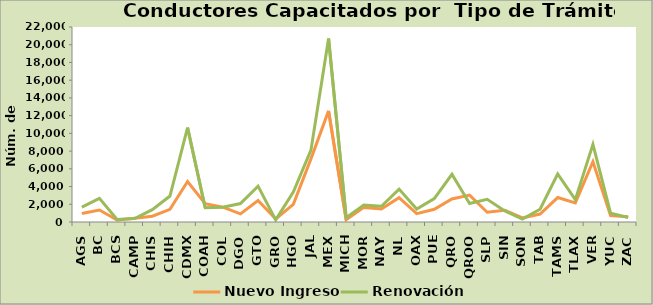
| Category | Nuevo Ingreso | Renovación |
|---|---|---|
| AGS | 957 | 1677 |
| BC | 1358 | 2666 |
| BCS | 223 | 280 |
| CAMP | 436 | 392 |
| CHIS | 649 | 1389 |
| CHIH | 1432 | 2927 |
| CDMX | 4566 | 10641 |
| COAH | 2066 | 1613 |
| COL | 1674 | 1664 |
| DGO | 912 | 2086 |
| GTO | 2421 | 4044 |
| GRO | 340 | 235 |
| HGO | 1997 | 3370 |
| JAL | 7122 | 8100 |
| MEX | 12537 | 20701 |
| MICH | 256 | 491 |
| MOR | 1649 | 1907 |
| NAY | 1458 | 1780 |
| NL | 2740 | 3712 |
| OAX | 946 | 1459 |
| PUE | 1436 | 2637 |
| QRO | 2602 | 5385 |
| QROO | 3037 | 2082 |
| SLP | 1101 | 2556 |
| SIN | 1324 | 1250 |
| SON | 466 | 335 |
| TAB | 899 | 1442 |
| TAMS | 2759 | 5420 |
| TLAX | 2152 | 2519 |
| VER | 6798 | 8760 |
| YUC | 722 | 991 |
| ZAC | 585 | 499 |